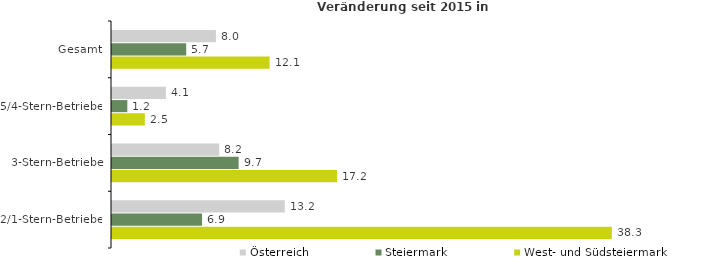
| Category | Österreich | Steiermark | West- und Südsteiermark |
|---|---|---|---|
| Gesamt | 7.97 | 5.689 | 12.079 |
| 5/4-Stern-Betriebe | 4.13 | 1.174 | 2.518 |
| 3-Stern-Betriebe | 8.22 | 9.709 | 17.248 |
| 2/1-Stern-Betriebe | 13.246 | 6.904 | 38.318 |